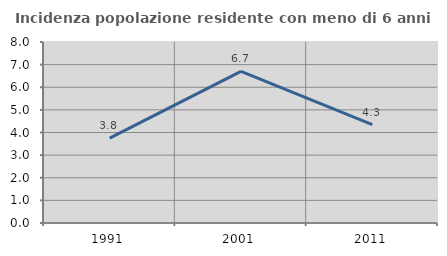
| Category | Incidenza popolazione residente con meno di 6 anni |
|---|---|
| 1991.0 | 3.75 |
| 2001.0 | 6.699 |
| 2011.0 | 4.348 |